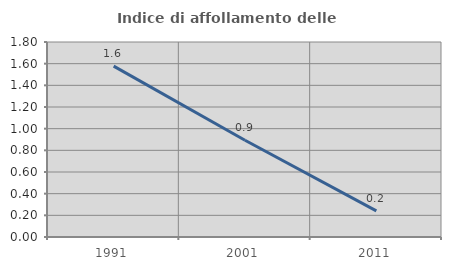
| Category | Indice di affollamento delle abitazioni  |
|---|---|
| 1991.0 | 1.577 |
| 2001.0 | 0.893 |
| 2011.0 | 0.242 |